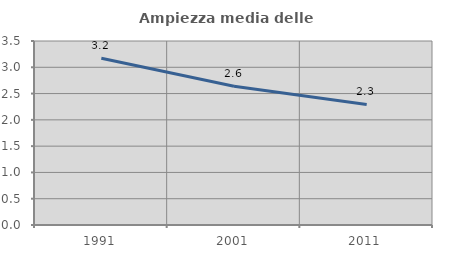
| Category | Ampiezza media delle famiglie |
|---|---|
| 1991.0 | 3.173 |
| 2001.0 | 2.639 |
| 2011.0 | 2.294 |